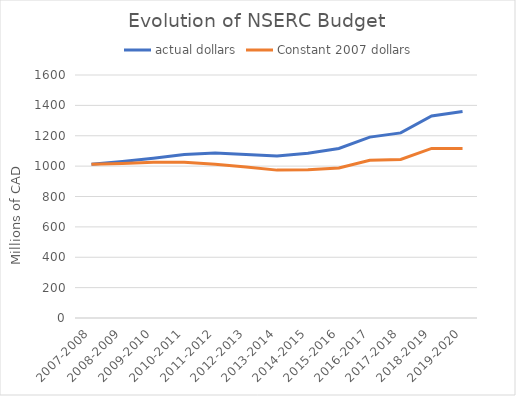
| Category | actual dollars | Constant 2007 dollars |
|---|---|---|
| 2007-2008 | 1012.5 | 1012.5 |
| 2008-2009 | 1029.8 | 1017.98 |
| 2009-2010 | 1051.3 | 1025.66 |
| 2010-2011 | 1075.94 | 1025.58 |
| 2011-2012 | 1085.7 | 1011.63 |
| 2012-2013 | 1075.9 | 994.23 |
| 2013-2014 | 1066.7 | 973.68 |
| 2014-2015 | 1085 | 976.06 |
| 2015-2016 | 1116 | 988.08 |
| 2016-2017 | 1191 | 1038.88 |
| 2017-2018 | 1219 | 1043.79 |
| 2018-2019 | 1330 | 1116.64 |
| 2019-2020 | 1359 | 1115.89 |